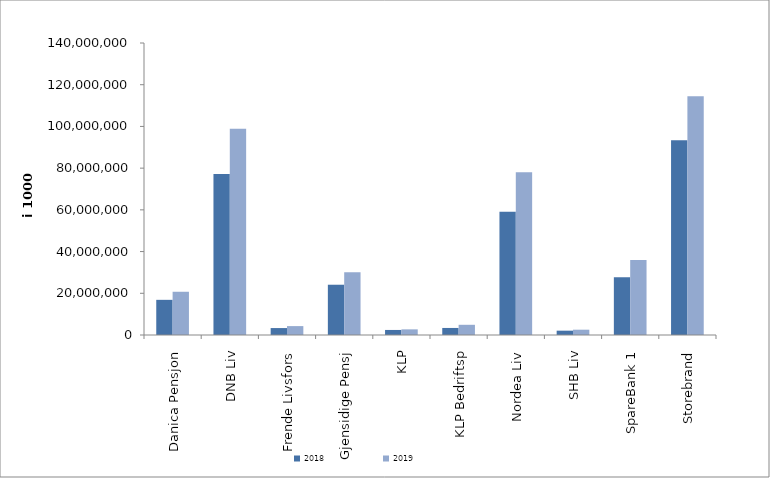
| Category | 2018 | 2019 |
|---|---|---|
| Danica Pensjon | 16857045.755 | 20732864.511 |
| DNB Liv | 77241342.397 | 98943003.869 |
| Frende Livsfors | 3327175.345 | 4266127 |
| Gjensidige Pensj | 24101780 | 30130866 |
| KLP | 2418695.24 | 2703759.027 |
| KLP Bedriftsp | 3376787 | 4891857 |
| Nordea Liv | 59037750 | 77977130 |
| SHB Liv | 2076510 | 2541186 |
| SpareBank 1 | 27670397.1 | 35920709.854 |
| Storebrand | 93401620.811 | 114501651.811 |